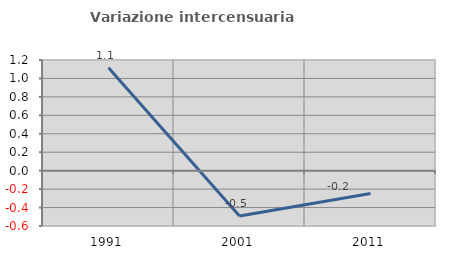
| Category | Variazione intercensuaria annua |
|---|---|
| 1991.0 | 1.117 |
| 2001.0 | -0.491 |
| 2011.0 | -0.248 |